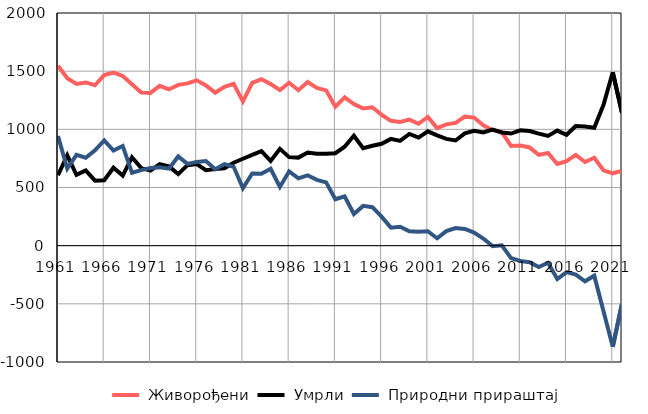
| Category |  Живорођени |  Умрли |  Природни прираштај |
|---|---|---|---|
| 1961.0 | 1547 | 605 | 942 |
| 1962.0 | 1439 | 777 | 662 |
| 1963.0 | 1390 | 609 | 781 |
| 1964.0 | 1403 | 647 | 756 |
| 1965.0 | 1379 | 559 | 820 |
| 1966.0 | 1467 | 562 | 905 |
| 1967.0 | 1487 | 670 | 817 |
| 1968.0 | 1459 | 602 | 857 |
| 1969.0 | 1387 | 760 | 627 |
| 1970.0 | 1316 | 667 | 649 |
| 1971.0 | 1313 | 645 | 668 |
| 1972.0 | 1374 | 701 | 673 |
| 1973.0 | 1343 | 681 | 662 |
| 1974.0 | 1382 | 615 | 767 |
| 1975.0 | 1395 | 692 | 703 |
| 1976.0 | 1421 | 701 | 720 |
| 1977.0 | 1377 | 649 | 728 |
| 1978.0 | 1315 | 658 | 657 |
| 1979.0 | 1366 | 665 | 701 |
| 1980.0 | 1391 | 713 | 678 |
| 1981.0 | 1240 | 747 | 493 |
| 1982.0 | 1400 | 780 | 620 |
| 1983.0 | 1430 | 812 | 618 |
| 1984.0 | 1389 | 728 | 661 |
| 1985.0 | 1337 | 832 | 505 |
| 1986.0 | 1400 | 761 | 639 |
| 1987.0 | 1336 | 757 | 579 |
| 1988.0 | 1406 | 801 | 605 |
| 1989.0 | 1356 | 790 | 566 |
| 1990.0 | 1335 | 791 | 544 |
| 1991.0 | 1194 | 795 | 399 |
| 1992.0 | 1275 | 851 | 424 |
| 1993.0 | 1217 | 945 | 272 |
| 1994.0 | 1180 | 838 | 342 |
| 1995.0 | 1190 | 859 | 331 |
| 1996.0 | 1125 | 876 | 249 |
| 1997.0 | 1073 | 918 | 155 |
| 1998.0 | 1063 | 900 | 163 |
| 1999.0 | 1084 | 960 | 124 |
| 2000.0 | 1048 | 929 | 119 |
| 2001.0 | 1107 | 983 | 124 |
| 2002.0 | 1011 | 948 | 63 |
| 2003.0 | 1043 | 918 | 125 |
| 2004.0 | 1055 | 904 | 151 |
| 2005.0 | 1109 | 965 | 144 |
| 2006.0 | 1101 | 988 | 113 |
| 2007.0 | 1035 | 974 | 61 |
| 2008.0 | 993 | 997 | -4 |
| 2009.0 | 976 | 973 | 3 |
| 2010.0 | 857 | 964 | -107 |
| 2011.0 | 860 | 992 | -132 |
| 2012.0 | 844 | 986 | -142 |
| 2013.0 | 780 | 963 | -183 |
| 2014.0 | 796 | 943 | -147 |
| 2015.0 | 702 | 989 | -287 |
| 2016.0 | 726 | 953 | -227 |
| 2017.0 | 780 | 1029 | -249 |
| 2018.0 | 719 | 1025 | -306 |
| 2019.0 | 756 | 1014 | -258 |
| 2020.0 | 648 | 1211 | -563 |
| 2021.0 | 622 | 1491 | -869 |
| 2022.0 | 643 | 1142 | -499 |